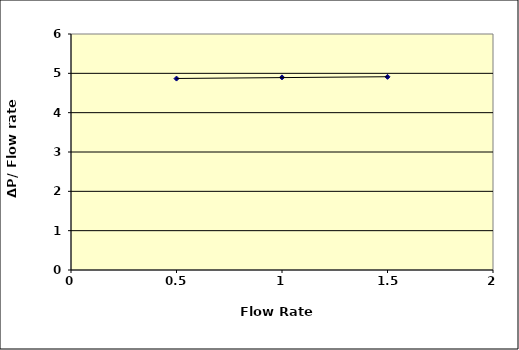
| Category | Series 0 |
|---|---|
| nan | 0 |
| 0.5 | 4.867 |
| 1.0 | 4.897 |
| 1.5 | 4.911 |